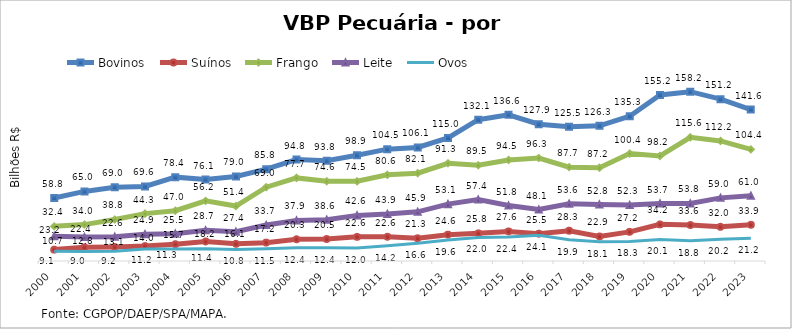
| Category | Bovinos | Suínos | Frango | Leite | Ovos |
|---|---|---|---|---|---|
| 2000 | 58.83 | 10.652 | 32.371 | 23.237 | 9.086 |
| 2001 | 65.031 | 12.779 | 34.025 | 22.361 | 8.953 |
| 2002 | 69.01 | 13.098 | 38.838 | 22.642 | 9.224 |
| 2003 | 69.649 | 13.998 | 44.279 | 24.934 | 11.158 |
| 2004 | 78.363 | 15.738 | 47.018 | 25.483 | 11.308 |
| 2005 | 76.079 | 18.247 | 56.213 | 28.662 | 11.385 |
| 2006 | 78.989 | 16.051 | 51.353 | 27.377 | 10.815 |
| 2007 | 85.843 | 17.164 | 68.998 | 33.656 | 11.494 |
| 2008 | 94.781 | 20.323 | 77.669 | 37.861 | 12.413 |
| 2009 | 93.792 | 20.544 | 74.573 | 38.599 | 12.377 |
| 2010 | 98.885 | 22.6 | 74.483 | 42.628 | 12.038 |
| 2011 | 104.537 | 22.636 | 80.557 | 43.944 | 14.185 |
| 2012 | 106.095 | 21.254 | 82.061 | 45.92 | 16.628 |
| 2013 | 114.97 | 24.609 | 91.335 | 53.138 | 19.557 |
| 2014 | 132.079 | 25.847 | 89.487 | 57.382 | 21.973 |
| 2015 | 136.625 | 27.622 | 94.471 | 51.797 | 22.373 |
| 2016 | 127.887 | 25.492 | 96.259 | 48.062 | 24.119 |
| 2017 | 125.499 | 28.298 | 87.675 | 53.551 | 19.881 |
| 2018 | 126.34 | 22.918 | 87.198 | 52.755 | 18.078 |
| 2019 | 135.283 | 27.24 | 100.399 | 52.266 | 18.309 |
| 2020 | 155.177 | 34.241 | 98.227 | 53.737 | 20.107 |
| 2021 | 158.24 | 33.631 | 115.554 | 53.796 | 18.842 |
| 2022 | 151.241 | 31.958 | 112.186 | 58.996 | 20.232 |
| 2023 | 141.573 | 33.863 | 104.361 | 60.97 | 21.172 |